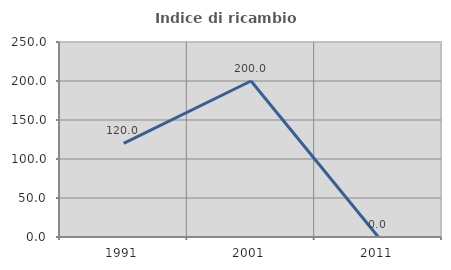
| Category | Indice di ricambio occupazionale  |
|---|---|
| 1991.0 | 120 |
| 2001.0 | 200 |
| 2011.0 | 0 |